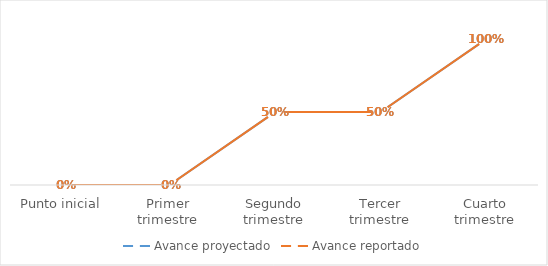
| Category | Avance proyectado | Avance reportado |
|---|---|---|
| Punto inicial | 0 | 0 |
| Primer trimestre | 0 | 0 |
| Segundo trimestre | 0.5 | 0.5 |
| Tercer trimestre | 0.5 | 0.5 |
| Cuarto trimestre | 1 | 1 |